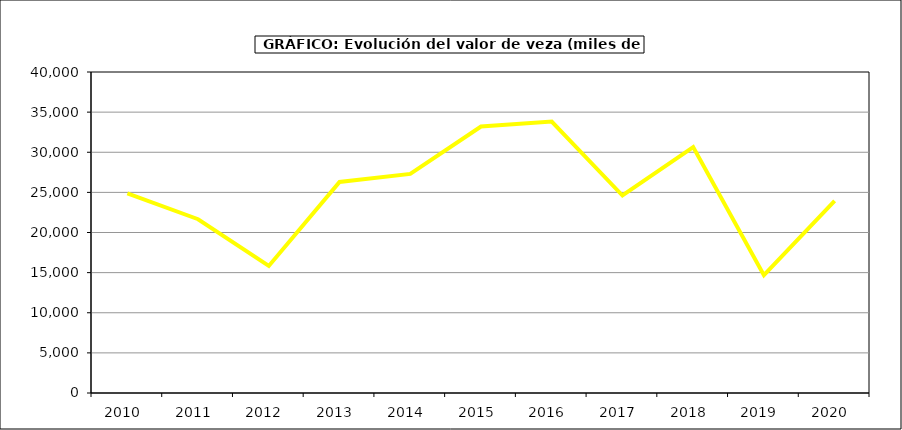
| Category | Valor |
|---|---|
| 2010.0 | 24873.072 |
| 2011.0 | 21651.853 |
| 2012.0 | 15834 |
| 2013.0 | 26306.52 |
| 2014.0 | 27301.452 |
| 2015.0 | 33211 |
| 2016.0 | 33824 |
| 2017.0 | 24609.102 |
| 2018.0 | 30638.594 |
| 2019.0 | 14686.227 |
| 2020.0 | 23930.599 |